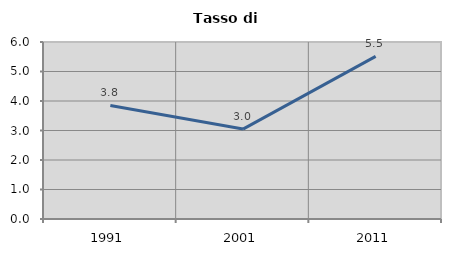
| Category | Tasso di disoccupazione   |
|---|---|
| 1991.0 | 3.848 |
| 2001.0 | 3.048 |
| 2011.0 | 5.512 |